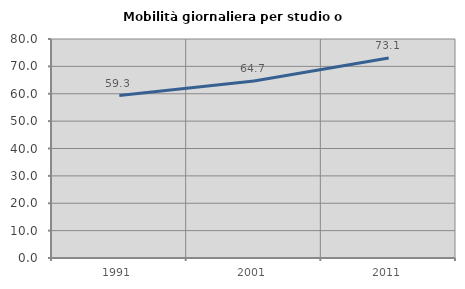
| Category | Mobilità giornaliera per studio o lavoro |
|---|---|
| 1991.0 | 59.331 |
| 2001.0 | 64.682 |
| 2011.0 | 73.06 |